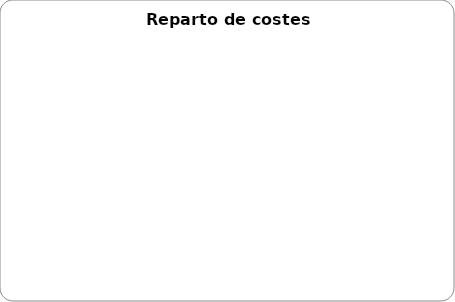
| Category | Series 0 |
|---|---|
| Personal | 0 |
| Suministros | 0 |
| Gastos Generales | 0 |
| Alquileres | 0 |
| Seguros y Tributos | 0 |
| Otros | 0 |